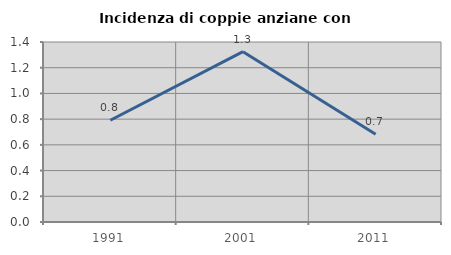
| Category | Incidenza di coppie anziane con figli |
|---|---|
| 1991.0 | 0.792 |
| 2001.0 | 1.325 |
| 2011.0 | 0.683 |